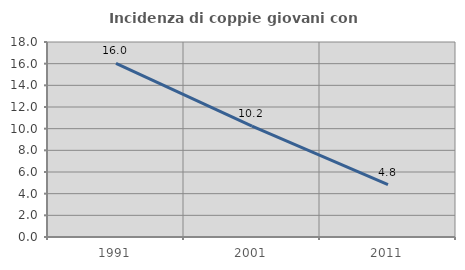
| Category | Incidenza di coppie giovani con figli |
|---|---|
| 1991.0 | 16.017 |
| 2001.0 | 10.232 |
| 2011.0 | 4.824 |